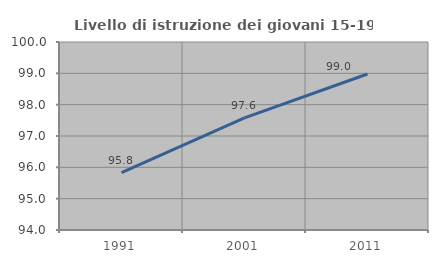
| Category | Livello di istruzione dei giovani 15-19 anni |
|---|---|
| 1991.0 | 95.833 |
| 2001.0 | 97.581 |
| 2011.0 | 98.98 |